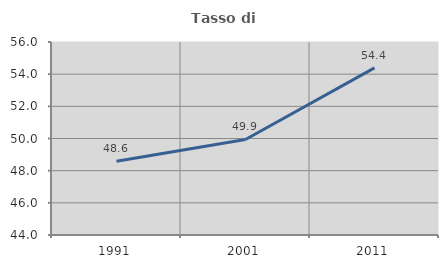
| Category | Tasso di occupazione   |
|---|---|
| 1991.0 | 48.59 |
| 2001.0 | 49.941 |
| 2011.0 | 54.394 |